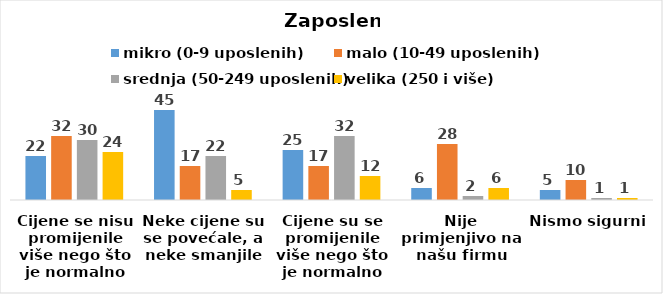
| Category | mikro (0-9 uposlenih) | malo (10-49 uposlenih) | srednja (50-249 uposlenih) | velika (250 i više) |
|---|---|---|---|---|
| Cijene se nisu promijenile više nego što je normalno | 22 | 32 | 30 | 24 |
| Neke cijene su se povećale, a neke smanjile | 45 | 17 | 22 | 5 |
| Cijene su se promijenile više nego što je normalno | 25 | 17 | 32 | 12 |
| Nije primjenjivo na našu firmu | 6 | 28 | 2 | 6 |
| Nismo sigurni | 5 | 10 | 1 | 1 |